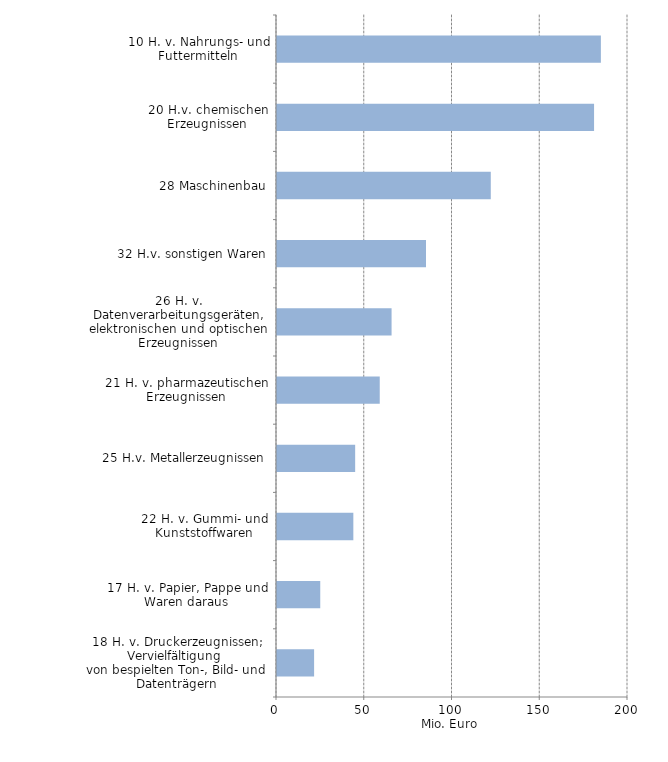
| Category | Mio. Euro |
|---|---|
| 18 H. v. Druckerzeugnissen; Vervielfältigung 
von bespielten Ton-, Bild- und Datenträgern | 21.142 |
| 17 H. v. Papier, Pappe und Waren daraus | 24.644 |
| 22 H. v. Gummi- und Kunststoffwaren | 43.5 |
| 25 H.v. Metallerzeugnissen | 44.537 |
| 21 H. v. pharmazeutischen Erzeugnissen | 58.547 |
| 26 H. v. Datenverarbeitungsgeräten, elektronischen und optischen Erzeugnissen | 65.284 |
| 32 H.v. sonstigen Waren | 84.9 |
| 28 Maschinenbau | 121.815 |
| 20 H.v. chemischen Erzeugnissen | 180.66 |
| 10 H. v. Nahrungs- und Futtermitteln | 184.55 |